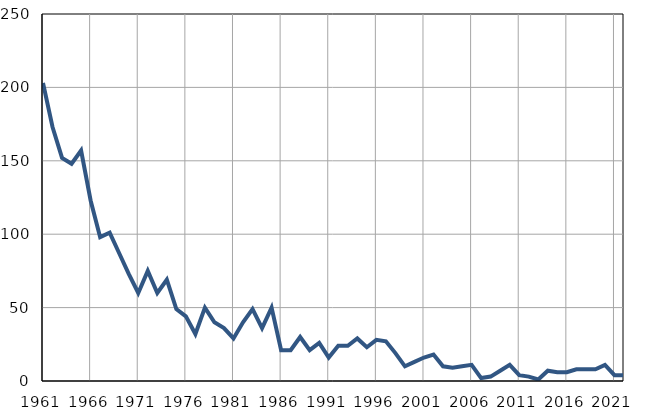
| Category | Infants
deaths |
|---|---|
| 1961.0 | 203 |
| 1962.0 | 173 |
| 1963.0 | 152 |
| 1964.0 | 148 |
| 1965.0 | 157 |
| 1966.0 | 123 |
| 1967.0 | 98 |
| 1968.0 | 101 |
| 1969.0 | 87 |
| 1970.0 | 73 |
| 1971.0 | 60 |
| 1972.0 | 75 |
| 1973.0 | 60 |
| 1974.0 | 69 |
| 1975.0 | 49 |
| 1976.0 | 44 |
| 1977.0 | 32 |
| 1978.0 | 50 |
| 1979.0 | 40 |
| 1980.0 | 36 |
| 1981.0 | 29 |
| 1982.0 | 40 |
| 1983.0 | 49 |
| 1984.0 | 36 |
| 1985.0 | 50 |
| 1986.0 | 21 |
| 1987.0 | 21 |
| 1988.0 | 30 |
| 1989.0 | 21 |
| 1990.0 | 26 |
| 1991.0 | 16 |
| 1992.0 | 24 |
| 1993.0 | 24 |
| 1994.0 | 29 |
| 1995.0 | 23 |
| 1996.0 | 28 |
| 1997.0 | 27 |
| 1998.0 | 19 |
| 1999.0 | 10 |
| 2000.0 | 13 |
| 2001.0 | 16 |
| 2002.0 | 18 |
| 2003.0 | 10 |
| 2004.0 | 9 |
| 2005.0 | 10 |
| 2006.0 | 11 |
| 2007.0 | 2 |
| 2008.0 | 3 |
| 2009.0 | 7 |
| 2010.0 | 11 |
| 2011.0 | 4 |
| 2012.0 | 3 |
| 2013.0 | 1 |
| 2014.0 | 7 |
| 2015.0 | 6 |
| 2016.0 | 6 |
| 2017.0 | 8 |
| 2018.0 | 8 |
| 2019.0 | 8 |
| 2020.0 | 11 |
| 2021.0 | 4 |
| 2022.0 | 4 |